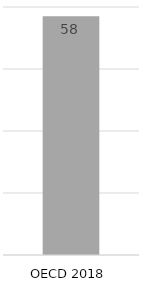
| Category | OECD 2018 |
|---|---|
| OECD 2018 | 57.749 |